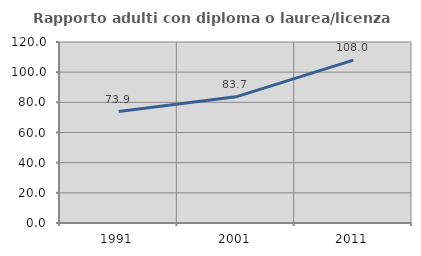
| Category | Rapporto adulti con diploma o laurea/licenza media  |
|---|---|
| 1991.0 | 73.869 |
| 2001.0 | 83.652 |
| 2011.0 | 107.963 |